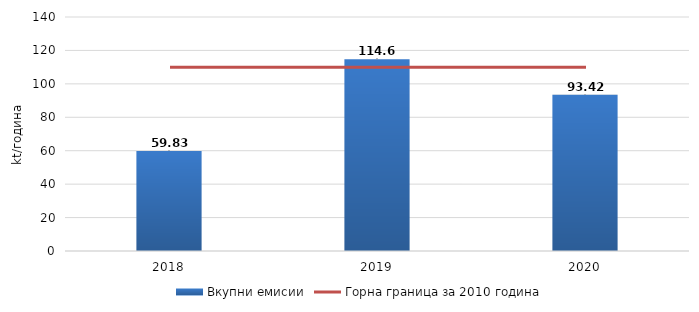
| Category | Вкупни емисии |
|---|---|
| 2018.0 | 59.828 |
| 2019.0 | 114.655 |
| 2020.0 | 93.418 |